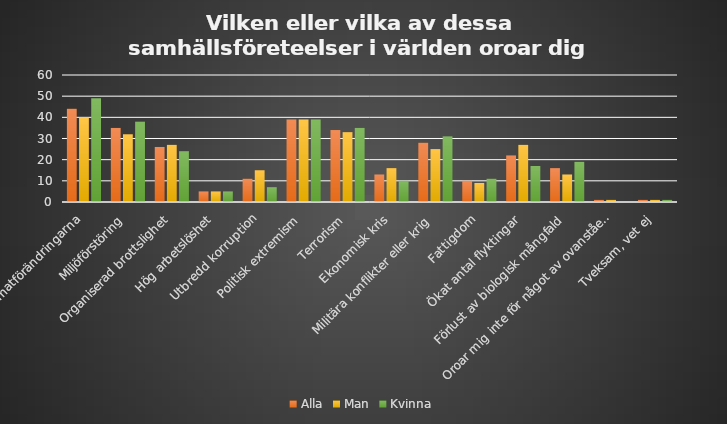
| Category | Alla | Man | Kvinna |
|---|---|---|---|
| Klimatförändringarna | 44 | 40 | 49 |
| Miljöförstöring | 35 | 32 | 38 |
| Organiserad brottslighet | 26 | 27 | 24 |
| Hög arbetslöshet | 5 | 5 | 5 |
| Utbredd korruption | 11 | 15 | 7 |
| Politisk extremism | 39 | 39 | 39 |
| Terrorism | 34 | 33 | 35 |
| Ekonomisk kris | 13 | 16 | 10 |
| Militära konflikter eller krig | 28 | 25 | 31 |
| Fattigdom | 10 | 9 | 11 |
| Ökat antal flyktingar | 22 | 27 | 17 |
| Förlust av biologisk mångfald | 16 | 13 | 19 |
| Oroar mig inte för något av ovanstående | 1 | 1 | 0 |
| Tveksam, vet ej | 1 | 1 | 1 |